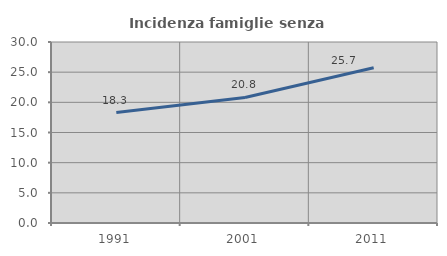
| Category | Incidenza famiglie senza nuclei |
|---|---|
| 1991.0 | 18.297 |
| 2001.0 | 20.807 |
| 2011.0 | 25.729 |